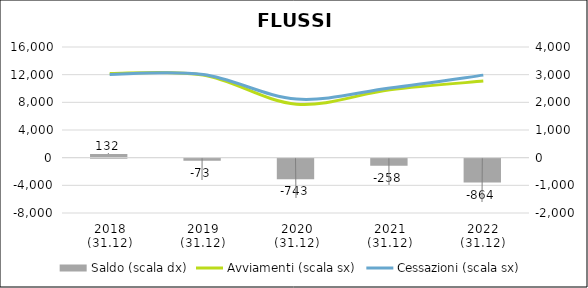
| Category | Saldo (scala dx) |
|---|---|
| 2018
(31.12) | 132 |
| 2019
(31.12) | -73 |
| 2020
(31.12) | -743 |
| 2021
(31.12) | -258 |
| 2022
(31.12) | -864 |